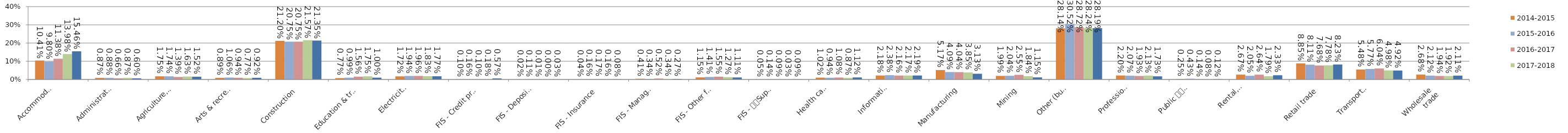
| Category | 2014-2015 | 2015-2016 | 2016-2017 | 2017-2018 | 2018-2019 |
|---|---|---|---|---|---|
| Accommodation
& food services | 0.104 | 0.098 | 0.114 | 0.14 | 0.155 |
| Administrative
& support services | 0.009 | 0.009 | 0.007 | 0.009 | 0.006 |
| Agriculture, forestry
 & fishing | 0.017 | 0.017 | 0.014 | 0.016 | 0.015 |
| Arts & recreation
 services | 0.009 | 0.011 | 0.009 | 0.008 | 0.009 |
| Construction | 0.212 | 0.208 | 0.207 | 0.216 | 0.214 |
| Education & training | 0.008 | 0.01 | 0.016 | 0.017 | 0.01 |
| Electricity, gas, 
water & waste 
services | 0.017 | 0.019 | 0.02 | 0.018 | 0.018 |
| FIS - Credit provider | 0.001 | 0.002 | 0.001 | 0.002 | 0.006 |
| FIS - Deposit taking 
institutions | 0 | 0.001 | 0 | 0 | 0 |
| FIS - Insurance | 0 | 0.002 | 0.002 | 0.002 | 0.001 |
| FIS - Managed 
investments | 0.004 | 0.003 | 0.005 | 0.003 | 0.003 |
| FIS - Other financial 
services | 0.011 | 0.014 | 0.015 | 0.013 | 0.011 |
| FIS - 
Superannuation | 0 | 0.001 | 0.001 | 0 | 0.001 |
| Health care
& social 
assistance | 0.01 | 0.009 | 0.011 | 0.009 | 0.011 |
| Information 
media & 
telecommunications | 0.022 | 0.024 | 0.022 | 0.022 | 0.022 |
| Manufacturing | 0.052 | 0.041 | 0.04 | 0.038 | 0.031 |
| Mining | 0.02 | 0.02 | 0.025 | 0.018 | 0.011 |
| Other (business
 & personal) 
services | 0.281 | 0.305 | 0.287 | 0.282 | 0.282 |
| Professional, 
scientific & 
technical services | 0.022 | 0.021 | 0.019 | 0.021 | 0.017 |
| Public 
administration
& safety | 0.003 | 0.004 | 0.001 | 0.001 | 0.001 |
| Rental, 
hiring & 
real estate 
services | 0.027 | 0.02 | 0.026 | 0.018 | 0.023 |
| Retail trade | 0.088 | 0.081 | 0.077 | 0.078 | 0.082 |
| Transport, 
postal & 
warehousing | 0.055 | 0.058 | 0.06 | 0.05 | 0.049 |
| Wholesale 
trade | 0.027 | 0.021 | 0.019 | 0.019 | 0.021 |